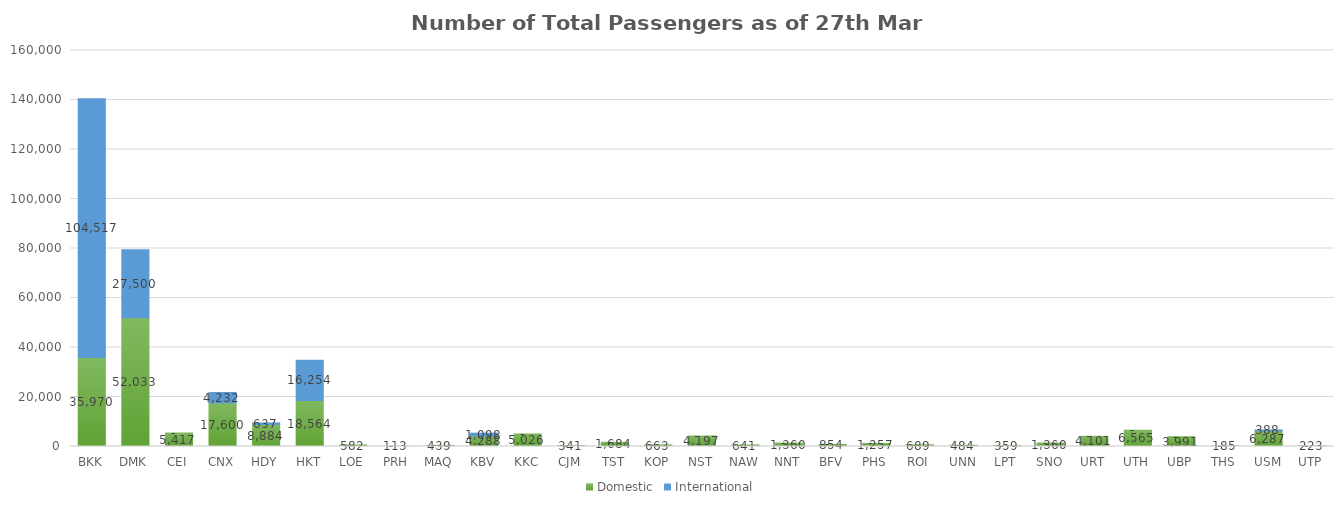
| Category | Domestic | International |
|---|---|---|
| BKK | 35970 | 104517 |
| DMK | 52033 | 27500 |
| CEI | 5417 | 0 |
| CNX | 17600 | 4232 |
| HDY | 8884 | 637 |
| HKT | 18564 | 16254 |
| LOE | 582 | 0 |
| PRH | 113 | 0 |
| MAQ | 439 | 0 |
| KBV | 4288 | 1098 |
| KKC | 5026 | 0 |
| CJM | 341 | 0 |
| TST | 1684 | 0 |
| KOP | 663 | 0 |
| NST | 4197 | 0 |
| NAW | 641 | 0 |
| NNT | 1360 | 0 |
| BFV | 854 | 0 |
| PHS | 1257 | 0 |
| ROI | 689 | 0 |
| UNN | 484 | 0 |
| LPT | 359 | 0 |
| SNO | 1360 | 0 |
| URT | 4101 | 0 |
| UTH | 6565 | 0 |
| UBP | 3991 | 0 |
| THS | 185 | 0 |
| USM | 6287 | 388 |
| UTP | 223 | 0 |